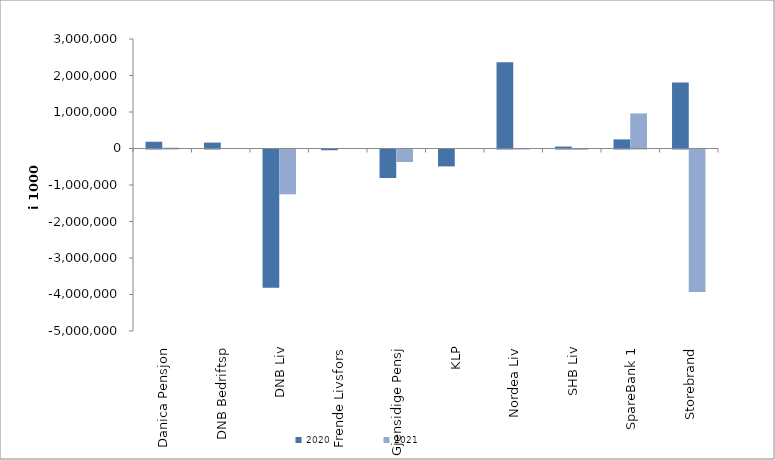
| Category | 2020 | 2021 |
|---|---|---|
| Danica Pensjon | 184923.247 | 24962.468 |
| DNB Bedriftsp | 162061 | 0 |
| DNB Liv | -3785522 | -1227148 |
| Frende Livsfors | -19904 | 0 |
| Gjensidige Pensj | -781255.8 | -342266 |
| KLP | -462823.85 | 0 |
| Nordea Liv | 2363395.028 | 13147.515 |
| SHB Liv | 53104.75 | -7905.02 |
| SpareBank 1 | 249798.303 | 960545.455 |
| Storebrand | 1810308.116 | -3907287.845 |